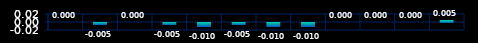
| Category | Series 0 |
|---|---|
| 0 | 0 |
| 1 | -0.005 |
| 2 | 0 |
| 3 | -0.005 |
| 4 | -0.01 |
| 5 | -0.005 |
| 6 | -0.01 |
| 7 | -0.01 |
| 8 | 0 |
| 9 | 0 |
| 10 | 0 |
| 11 | 0.005 |